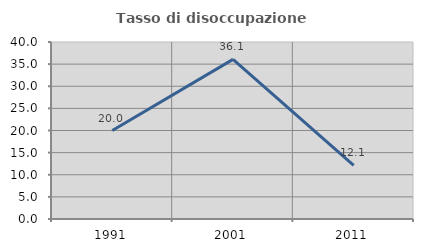
| Category | Tasso di disoccupazione giovanile  |
|---|---|
| 1991.0 | 20 |
| 2001.0 | 36.066 |
| 2011.0 | 12.121 |